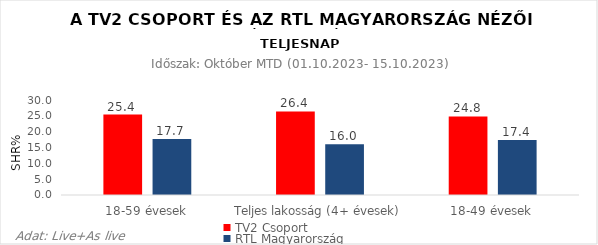
| Category | TV2 Csoport | RTL Magyarország |
|---|---|---|
| 18-59 évesek | 25.4 | 17.7 |
| Teljes lakosság (4+ évesek) | 26.4 | 16 |
| 18-49 évesek | 24.8 | 17.4 |